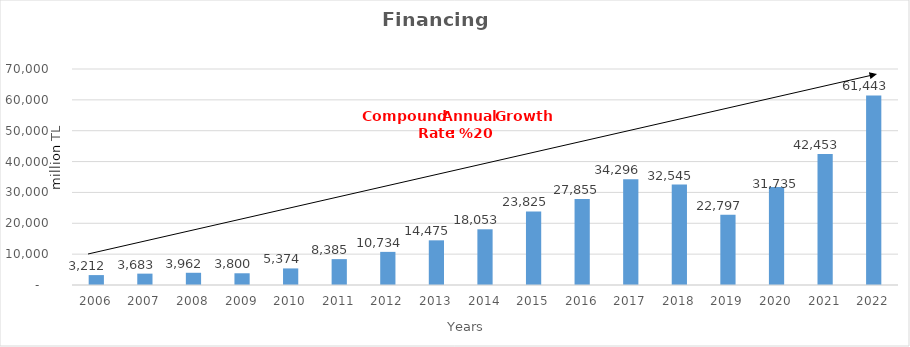
| Category | Financing |
|---|---|
| 2006.0 | 3212.153 |
| 2007.0 | 3682.969 |
| 2008.0 | 3962.227 |
| 2009.0 | 3800.05 |
| 2010.0 | 5373.931 |
| 2011.0 | 8385.227 |
| 2012.0 | 10734.23 |
| 2013.0 | 14474.899 |
| 2014.0 | 18053.437 |
| 2015.0 | 23825 |
| 2016.0 | 27855 |
| 2017.0 | 34296 |
| 2018.0 | 32545 |
| 2019.0 | 22797 |
| 2020.0 | 31735 |
| 2021.0 | 42453 |
| 2022.0 | 61443 |